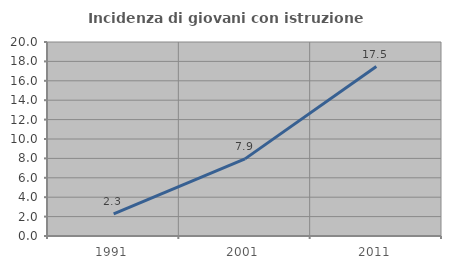
| Category | Incidenza di giovani con istruzione universitaria |
|---|---|
| 1991.0 | 2.29 |
| 2001.0 | 7.95 |
| 2011.0 | 17.473 |